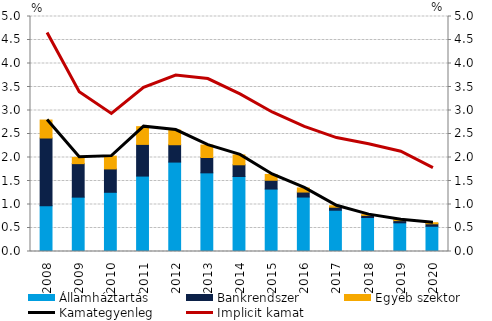
| Category | Államháztartás | Bankrendszer | Egyéb szektor |
|---|---|---|---|
| 0 | 0.976 | 1.439 | 0.382 |
| 1 | 1.157 | 0.713 | 0.134 |
| 2 | 1.26 | 0.497 | 0.272 |
| 3 | 1.605 | 0.674 | 0.378 |
| 4 | 1.902 | 0.369 | 0.312 |
| 5 | 1.674 | 0.327 | 0.264 |
| 6 | 1.595 | 0.25 | 0.21 |
| 7 | 1.329 | 0.187 | 0.123 |
| 8 | 1.158 | 0.106 | 0.088 |
| 9 | 0.878 | 0.064 | 0.031 |
| 10 | 0.723 | 0.045 | 0.017 |
| 11 | 0.61 | 0.047 | 0.018 |
| 12 | 0.537 | 0.053 | 0.023 |